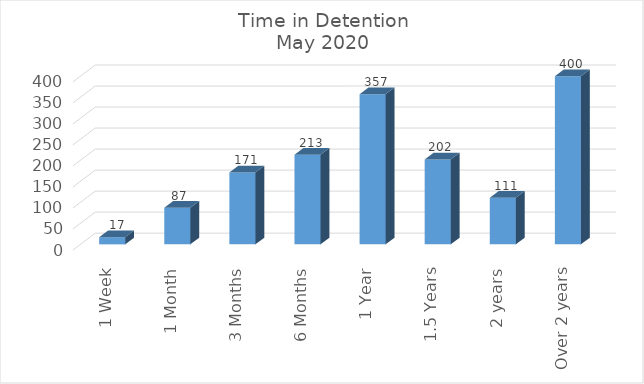
| Category | Series 0 |
|---|---|
| 1 Week | 17 |
| 1 Month | 87 |
| 3 Months | 171 |
| 6 Months | 213 |
| 1 Year | 357 |
| 1.5 Years | 202 |
| 2 years | 111 |
| Over 2 years | 400 |